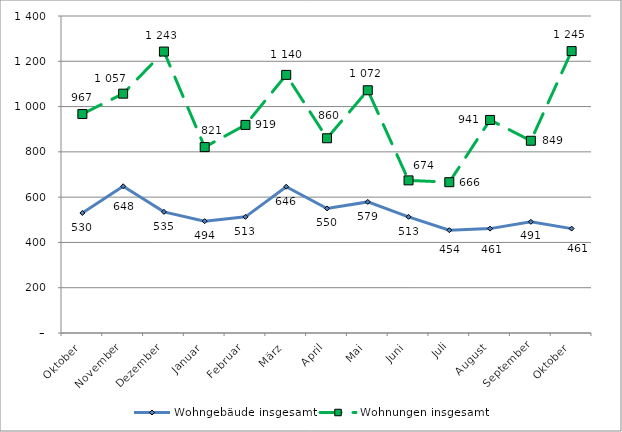
| Category | Wohngebäude insgesamt | Wohnungen insgesamt |
|---|---|---|
| Oktober | 530 | 967 |
| November | 648 | 1057 |
| Dezember | 535 | 1243 |
| Januar | 494 | 821 |
| Februar | 513 | 919 |
| März | 646 | 1140 |
| April | 550 | 860 |
| Mai | 579 | 1072 |
| Juni | 513 | 674 |
| Juli | 454 | 666 |
| August | 461 | 941 |
| September | 491 | 849 |
| Oktober | 461 | 1245 |